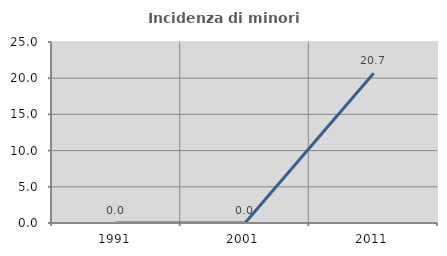
| Category | Incidenza di minori stranieri |
|---|---|
| 1991.0 | 0 |
| 2001.0 | 0 |
| 2011.0 | 20.69 |